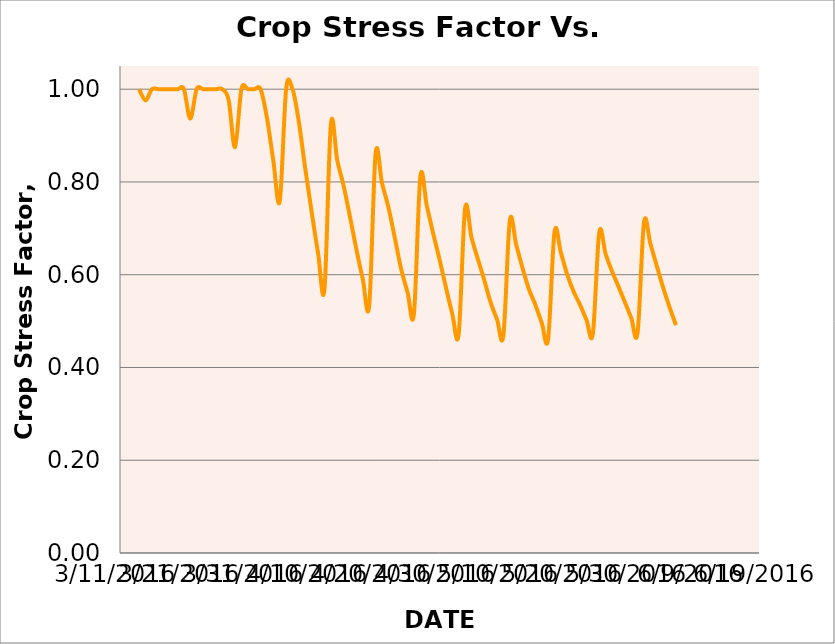
| Category | Series 0 |
|---|---|
| 42443.0 | 1 |
| 42444.0 | 0.976 |
| 42445.0 | 1 |
| 42446.0 | 1 |
| 42447.0 | 1 |
| 42448.0 | 1 |
| 42449.0 | 1 |
| 42450.0 | 1 |
| 42451.0 | 0.936 |
| 42452.0 | 1 |
| 42453.0 | 1 |
| 42454.0 | 1 |
| 42455.0 | 1 |
| 42456.0 | 1 |
| 42457.0 | 0.977 |
| 42458.0 | 0.875 |
| 42459.0 | 1 |
| 42460.0 | 1 |
| 42461.0 | 1 |
| 42462.0 | 1 |
| 42463.0 | 0.938 |
| 42464.0 | 0.845 |
| 42465.0 | 0.759 |
| 42466.0 | 1 |
| 42467.0 | 1 |
| 42468.0 | 0.929 |
| 42469.0 | 0.828 |
| 42470.0 | 0.735 |
| 42471.0 | 0.646 |
| 42472.0 | 0.569 |
| 42473.0 | 0.924 |
| 42474.0 | 0.846 |
| 42475.0 | 0.791 |
| 42476.0 | 0.724 |
| 42477.0 | 0.654 |
| 42478.0 | 0.59 |
| 42479.0 | 0.534 |
| 42480.0 | 0.861 |
| 42481.0 | 0.798 |
| 42482.0 | 0.746 |
| 42483.0 | 0.68 |
| 42484.0 | 0.612 |
| 42485.0 | 0.562 |
| 42486.0 | 0.516 |
| 42487.0 | 0.811 |
| 42488.0 | 0.75 |
| 42489.0 | 0.689 |
| 42490.0 | 0.633 |
| 42491.0 | 0.573 |
| 42492.0 | 0.516 |
| 42493.0 | 0.472 |
| 42494.0 | 0.742 |
| 42495.0 | 0.681 |
| 42496.0 | 0.634 |
| 42497.0 | 0.589 |
| 42498.0 | 0.54 |
| 42499.0 | 0.504 |
| 42500.0 | 0.469 |
| 42501.0 | 0.716 |
| 42502.0 | 0.665 |
| 42503.0 | 0.614 |
| 42504.0 | 0.568 |
| 42505.0 | 0.535 |
| 42506.0 | 0.496 |
| 42507.0 | 0.461 |
| 42508.0 | 0.692 |
| 42509.0 | 0.647 |
| 42510.0 | 0.6 |
| 42511.0 | 0.563 |
| 42512.0 | 0.535 |
| 42513.0 | 0.503 |
| 42514.0 | 0.473 |
| 42515.0 | 0.691 |
| 42516.0 | 0.645 |
| 42517.0 | 0.607 |
| 42518.0 | 0.575 |
| 42519.0 | 0.541 |
| 42520.0 | 0.507 |
| 42521.0 | 0.475 |
| 42522.0 | 0.713 |
| 42523.0 | 0.667 |
| 42524.0 | 0.619 |
| 42525.0 | 0.572 |
| 42526.0 | 0.53 |
| 42527.0 | 0.491 |